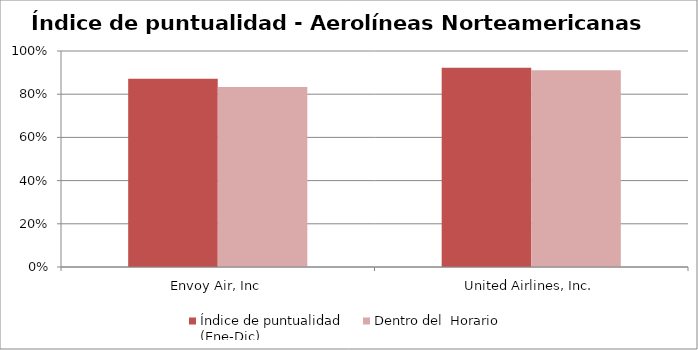
| Category | Índice de puntualidad
(Ene-Dic) | Dentro del  Horario |
|---|---|---|
| Envoy Air, Inc | 0.871 | 0.833 |
| United Airlines, Inc. | 0.922 | 0.911 |